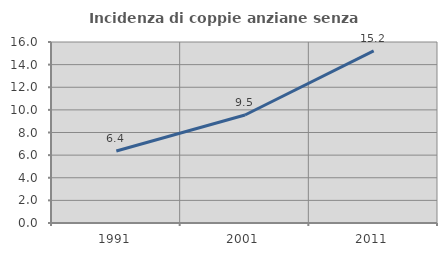
| Category | Incidenza di coppie anziane senza figli  |
|---|---|
| 1991.0 | 6.368 |
| 2001.0 | 9.546 |
| 2011.0 | 15.215 |